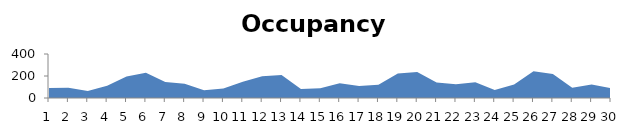
| Category | Series 0 |
|---|---|
| 0 | 90 |
| 1 | 94.114 |
| 2 | 62.775 |
| 3 | 111.714 |
| 4 | 195.257 |
| 5 | 229.229 |
| 6 | 144.563 |
| 7 | 128.714 |
| 8 | 70.7 |
| 9 | 86.197 |
| 10 | 147.056 |
| 11 | 198.465 |
| 12 | 209.014 |
| 13 | 82.859 |
| 14 | 88.464 |
| 15 | 135.113 |
| 16 | 109.014 |
| 17 | 120.085 |
| 18 | 223 |
| 19 | 236.169 |
| 20 | 140.8 |
| 21 | 124.143 |
| 22 | 143.229 |
| 23 | 73.5 |
| 24 | 122.831 |
| 25 | 243 |
| 26 | 218.211 |
| 27 | 93.93 |
| 28 | 123.099 |
| 29 | 90.174 |